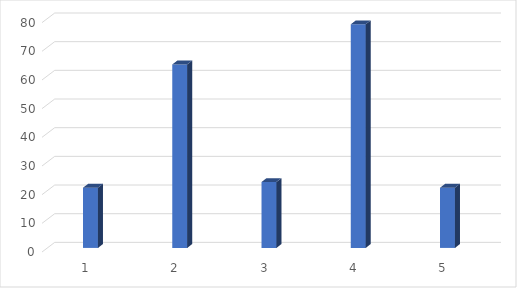
| Category | A |
|---|---|
| 0 | 21 |
| 1 | 64 |
| 2 | 23 |
| 3 | 78 |
| 4 | 21 |